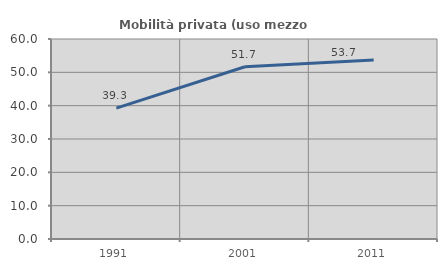
| Category | Mobilità privata (uso mezzo privato) |
|---|---|
| 1991.0 | 39.262 |
| 2001.0 | 51.667 |
| 2011.0 | 53.731 |